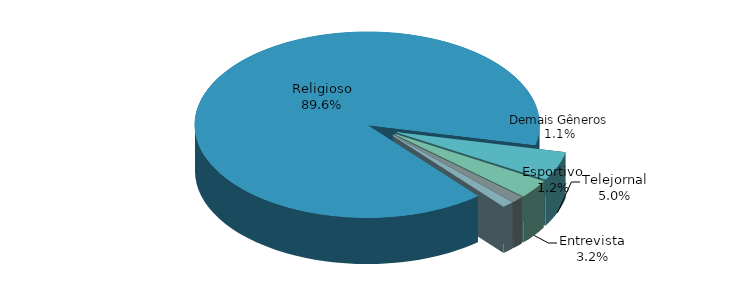
| Category | Series 0 |
|---|---|
| Religioso | 0.896 |
| Telejornal | 0.05 |
| Entrevista | 0.032 |
| Esportivo | 0.012 |
| Demais Gêneros | 0.011 |